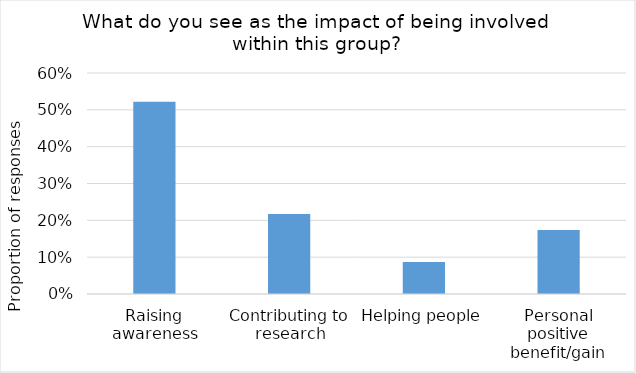
| Category | Proportion |
|---|---|
| Raising awareness
 | 0.522 |
| Contributing to research
 | 0.217 |
| Helping people 
 | 0.087 |
| Personal positive benefit/gain
 | 0.174 |